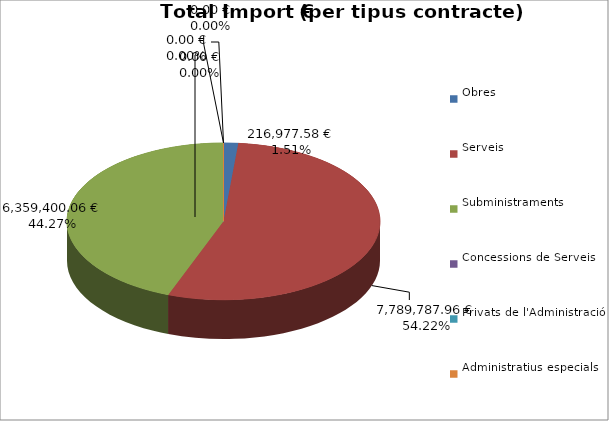
| Category | Total preu
(amb IVA) |
|---|---|
| Obres | 216977.58 |
| Serveis | 7789787.96 |
| Subministraments | 6359400.06 |
| Concessions de Serveis | 0 |
| Privats de l'Administració | 0 |
| Administratius especials | 0 |